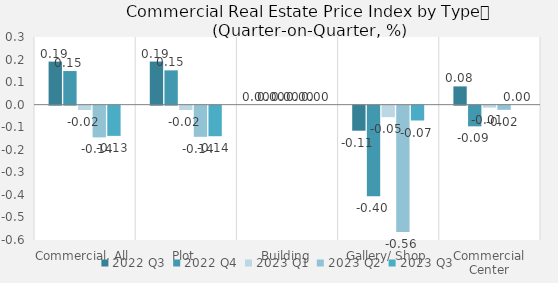
| Category | 2022 | 2023 |
|---|---|---|
| Commercial, All | 0.149 | -0.134 |
| Plot | 0.152 | -0.135 |
| Building | 0 | 0 |
| Gallery/ Shop | -0.402 | -0.066 |
| Commercial Center | -0.092 | 0 |